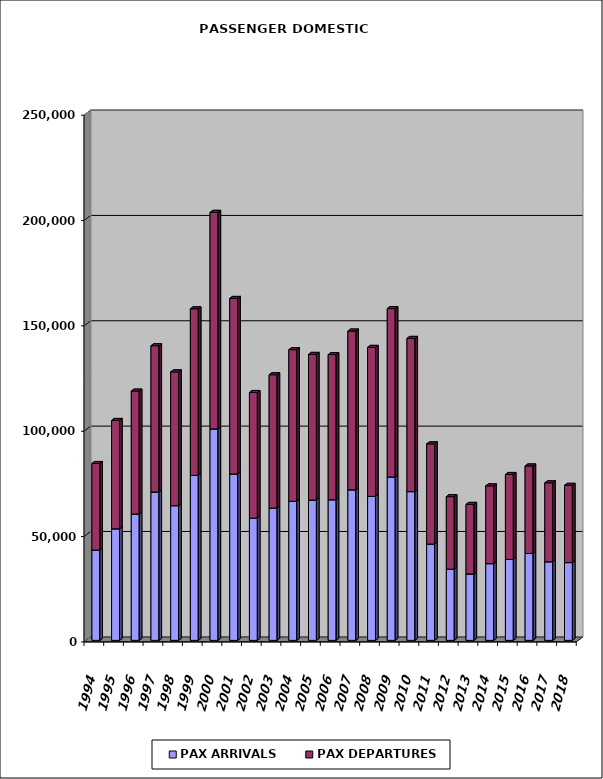
| Category | PAX ARRIVALS | PAX DEPARTURES |
|---|---|---|
| 1994.0 | 42867 | 41085 |
| 1995.0 | 52951 | 51434 |
| 1996.0 | 59966 | 58347 |
| 1997.0 | 70441 | 69414 |
| 1998.0 | 63941 | 63494 |
| 1999.0 | 78306 | 79077 |
| 2000.0 | 100364 | 102786 |
| 2001.0 | 78970 | 83327 |
| 2002.0 | 58025 | 59628 |
| 2003.0 | 62829 | 63261 |
| 2004.0 | 66038 | 71935 |
| 2005.0 | 66623 | 69114 |
| 2006.0 | 66762 | 68893 |
| 2007.0 | 71463 | 75343 |
| 2008.0 | 68354 | 70710 |
| 2009.0 | 77576 | 79914 |
| 2010.0 | 70613 | 72720 |
| 2011.0 | 45742 | 47529 |
| 2012.0 | 33792 | 34440 |
| 2013.0 | 31542 | 33003 |
| 2014.0 | 36423 | 36917 |
| 2015.0 | 38435 | 40310 |
| 2016.0 | 41241 | 41534 |
| 2017.0 | 37318 | 37469 |
| 2018.0 | 36927 | 36656 |